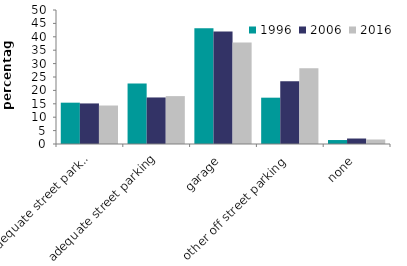
| Category | 1996 | 2006 | 2016 |
|---|---|---|---|
| inadequate street parking | 15.42 | 15.135 | 14.36 |
| adequate street parking | 22.569 | 17.367 | 17.869 |
| garage | 43.216 | 42.008 | 37.848 |
| other off street parking | 17.283 | 23.442 | 28.242 |
| none | 1.478 | 2.049 | 1.681 |